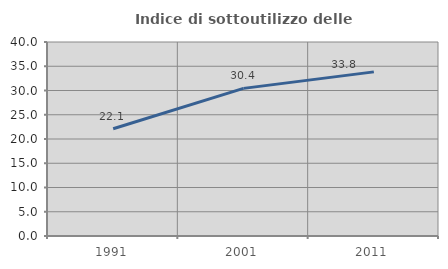
| Category | Indice di sottoutilizzo delle abitazioni  |
|---|---|
| 1991.0 | 22.11 |
| 2001.0 | 30.436 |
| 2011.0 | 33.838 |